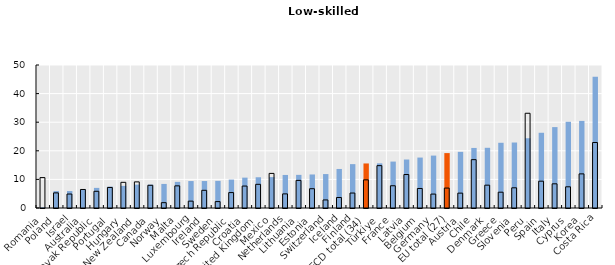
| Category | Foreign-born | Native-born |
|---|---|---|
| Romania | 0.248 | 10.631 |
| Poland | 5.912 | 5.285 |
| Israel | 5.922 | 4.879 |
| Australia | 6.621 | 6.477 |
| Slovak Republic | 7.036 | 5.842 |
| Portugal | 7.488 | 7.177 |
| Hungary | 7.734 | 8.978 |
| New Zealand | 8.172 | 9.131 |
| Canada | 8.183 | 7.944 |
| Norway | 8.415 | 1.867 |
| Malta | 9.136 | 7.743 |
| Luxembourg | 9.423 | 2.399 |
| Ireland | 9.428 | 6.188 |
| Sweden | 9.496 | 2.237 |
| Czech Republic | 9.937 | 5.391 |
| Croatia | 10.617 | 7.672 |
| United Kingdom | 10.748 | 8.281 |
| Mexico | 10.8 | 12.1 |
| Netherlands | 11.553 | 4.938 |
| Lithuania | 11.589 | 9.653 |
| Estonia | 11.723 | 6.743 |
| Switzerland | 11.864 | 2.816 |
| Iceland | 13.649 | 3.673 |
| Finland | 15.339 | 5.23 |
| OECD total (34) | 15.574 | 9.845 |
| Türkiye | 15.61 | 14.806 |
| France | 16.231 | 7.776 |
| Latvia | 16.953 | 11.705 |
| Belgium | 17.637 | 6.827 |
| Germany | 18.325 | 4.867 |
| EU total (27) | 19.196 | 6.968 |
| Austria | 19.637 | 5.199 |
| Chile | 21 | 16.9 |
| Denmark | 21.051 | 7.983 |
| Greece | 22.807 | 5.528 |
| Slovenia | 22.897 | 7.059 |
| Peru | 24.39 | 33.129 |
| Spain | 26.304 | 9.376 |
| Italy | 28.287 | 8.456 |
| Cyprus | 30.152 | 7.413 |
| Korea | 30.451 | 11.93 |
| Costa Rica | 45.9 | 22.9 |